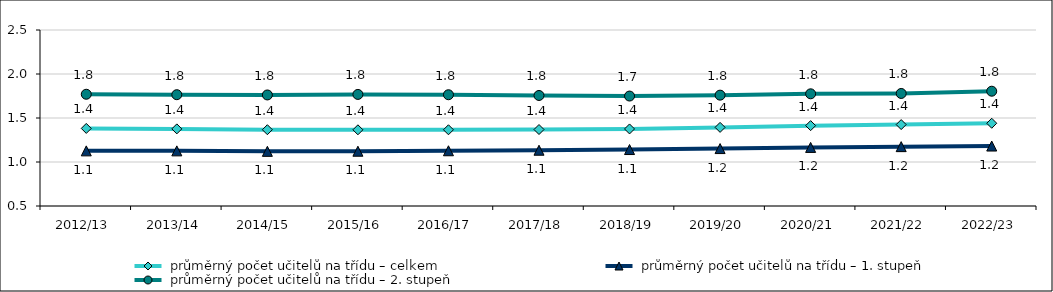
| Category |  průměrný počet učitelů na třídu – celkem |  průměrný počet učitelů na třídu – 1. stupeň |  průměrný počet učitelů na třídu – 2. stupeň |
|---|---|---|---|
| 2012/13 | 1.382 | 1.127 | 1.77 |
| 2013/14 | 1.376 | 1.127 | 1.765 |
| 2014/15 | 1.367 | 1.121 | 1.762 |
| 2015/16 | 1.366 | 1.122 | 1.768 |
| 2016/17 | 1.366 | 1.128 | 1.764 |
| 2017/18 | 1.369 | 1.134 | 1.756 |
| 2018/19 | 1.376 | 1.142 | 1.749 |
| 2019/20 | 1.393 | 1.153 | 1.76 |
| 2020/21 | 1.413 | 1.166 | 1.775 |
| 2021/22 | 1.425 | 1.175 | 1.779 |
| 2022/23 | 1.44 | 1.181 | 1.804 |